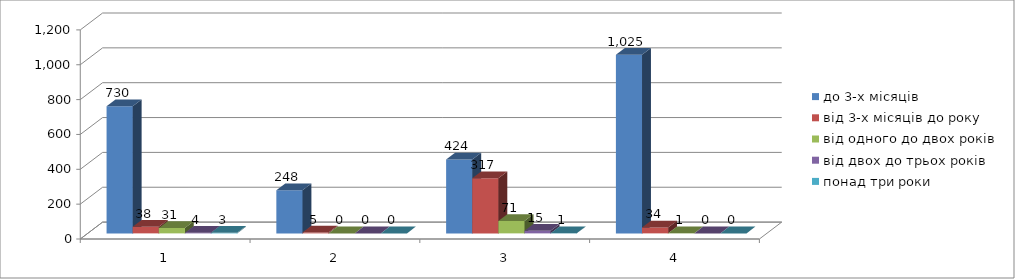
| Category | до 3-х місяців | від 3-х місяців до року | від одного до двох років | від двох до трьох років | понад три роки |
|---|---|---|---|---|---|
| 0 | 730 | 38 | 31 | 4 | 3 |
| 1 | 248 | 5 | 0 | 0 | 0 |
| 2 | 424 | 317 | 71 | 15 | 1 |
| 3 | 1025 | 34 | 1 | 0 | 0 |